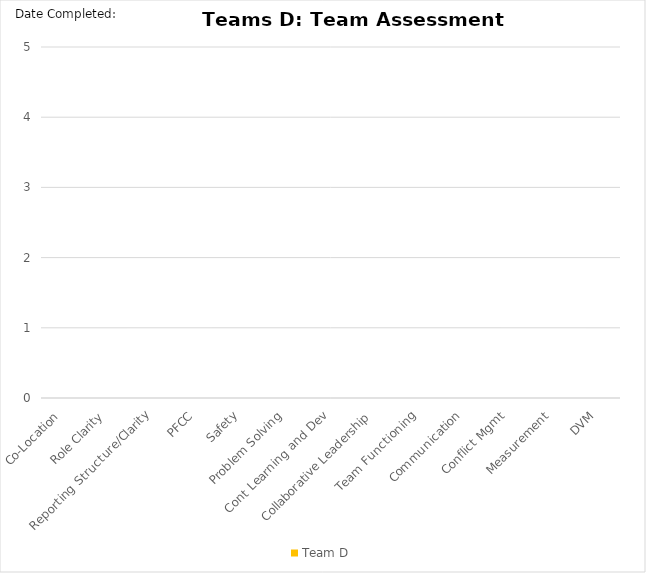
| Category | Team D |
|---|---|
| Co-Location | 0 |
| Role Clarity | 0 |
| Reporting Structure/Clarity | 0 |
| PFCC | 0 |
| Safety | 0 |
| Problem Solving | 0 |
| Cont Learning and Dev | 0 |
| Collaborative Leadership | 0 |
| Team Functioning | 0 |
| Communication | 0 |
| Conflict Mgmt | 0 |
| Measurement | 0 |
| DVM | 0 |